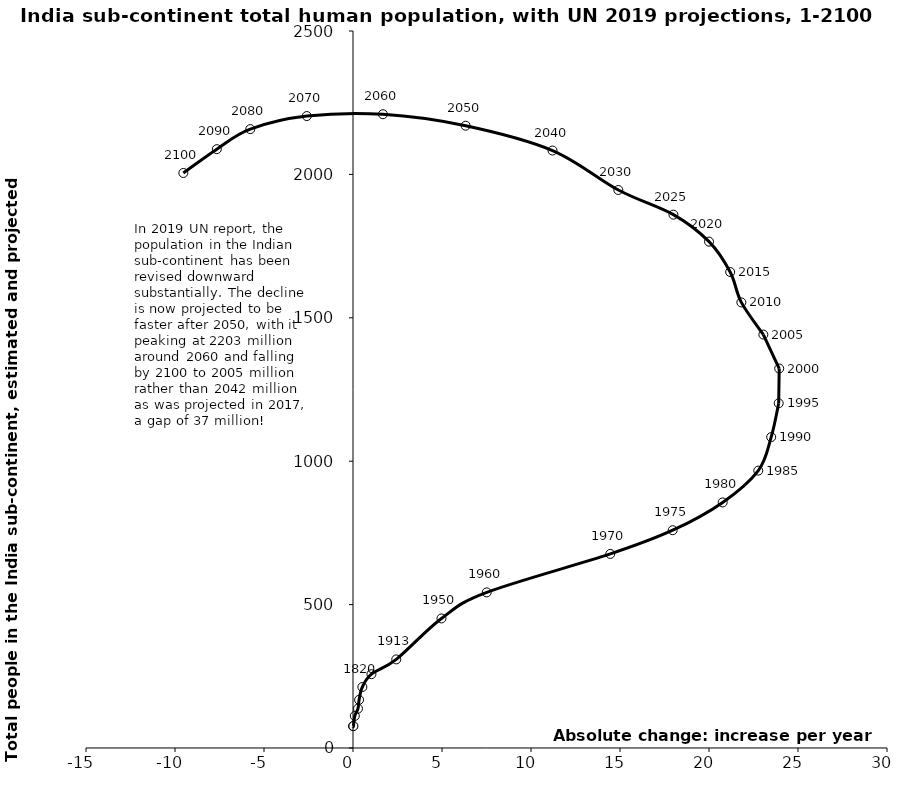
| Category | Series 0 |
|---|---|
| 0.0 | 76.295 |
| 0.02375205885027618 | 76.295 |
| 0.10172667490446857 | 111.899 |
| 0.2797483559872886 | 137.331 |
| 0.3421715428604853 | 167.849 |
| 0.526585140681955 | 212.609 |
| 1.0358619476831368 | 257.368 |
| 2.429922118646181 | 308.944 |
| 4.97116460244955 | 451.762 |
| 7.512407086252919 | 542.589 |
| 14.453793066666663 | 676.717 |
| 17.960547900000005 | 759.396 |
| 20.76904800000001 | 856.323 |
| 22.76782149999999 | 967.086 |
| 23.49327900000001 | 1084.001 |
| 23.915470400000004 | 1202.019 |
| 23.944062800000005 | 1323.155 |
| 23.0534535 | 1441.459 |
| 21.817593699999996 | 1553.69 |
| 21.18961330000004 | 1659.635 |
| 20.000937499999964 | 1765.586 |
| 18.000887700000042 | 1859.645 |
| 14.906178600000036 | 1945.595 |
| 11.208101099999919 | 2083.237 |
| 6.329362349999997 | 2169.757 |
| 1.6826865500000623 | 2209.825 |
| -2.5954653000000008 | 2203.411 |
| -5.769636150000087 | 2157.915 |
| -7.649934400000052 | 2088.018 |
| -9.530232650000016 | 2004.917 |